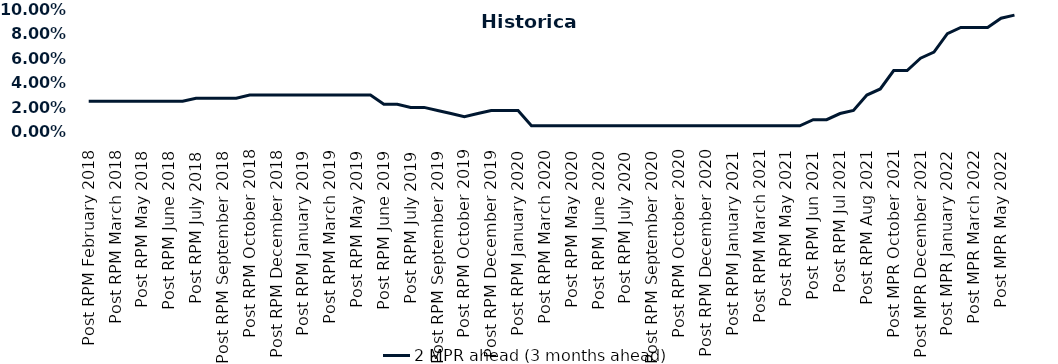
| Category | 2 MPR ahead (3 months ahead) |
|---|---|
| Post RPM February 2018 | 0.025 |
| Pre RPM March 2018 | 0.025 |
| Post RPM March 2018 | 0.025 |
| Pre RPM May 2018 | 0.025 |
| Post RPM May 2018 | 0.025 |
| Pre RPM June 2018 | 0.025 |
| Post RPM June 2018 | 0.025 |
| Pre RPM July 2018 | 0.025 |
| Post RPM July 2018 | 0.028 |
| Pre RPM September 2018 | 0.028 |
| Post RPM September 2018 | 0.028 |
| Pre RPM October 2018 | 0.028 |
| Post RPM October 2018 | 0.03 |
| Pre RPM December 2018 | 0.03 |
| Post RPM December 2018 | 0.03 |
| Pre RPM January 2019 | 0.03 |
| Post RPM January 2019 | 0.03 |
| Pre RPM March 2019 | 0.03 |
| Post RPM March 2019 | 0.03 |
| Pre RPM May 2019 | 0.03 |
| Post RPM May 2019 | 0.03 |
| Pre RPM June 2019 | 0.03 |
| Post RPM June 2019 | 0.022 |
| Pre RPM July 2019 | 0.022 |
| Post RPM July 2019 | 0.02 |
| Pre RPM September 2019 | 0.02 |
| Post RPM September 2019 | 0.018 |
| Pre RPM October 2019 | 0.015 |
| Post RPM October 2019 | 0.012 |
| Pre RPM December 2019 | 0.015 |
| Post RPM December 2019 | 0.018 |
| Pre RPM January 2020 | 0.018 |
| Post RPM January 2020 | 0.018 |
| Pre RPM March 2020 | 0.005 |
| Post RPM March 2020 | 0.005 |
| Pre RPM May 2020 | 0.005 |
| Post RPM May 2020 | 0.005 |
| Pre RPM June 2020 | 0.005 |
| Post RPM June 2020 | 0.005 |
| Pre RPM July 2020 | 0.005 |
| Post RPM July 2020 | 0.005 |
| Pre RPM September 2020 | 0.005 |
| Post RPM September 2020 | 0.005 |
| Pre RPM October 2020 | 0.005 |
| Post RPM October 2020 | 0.005 |
| Pre RPM December 2020 | 0.005 |
|  Post RPM December 2020 | 0.005 |
| Pre RPM January 2021 | 0.005 |
| Post RPM January 2021 | 0.005 |
|  Pre RPM March 2021 | 0.005 |
|  Post RPM March 2021 | 0.005 |
|  Pre RPM May 2021 | 0.005 |
|  Post RPM May 2021 | 0.005 |
|  Pre RPM Jun 2021 | 0.005 |
|   Post RPM Jun 2021 | 0.01 |
| Pre RPM Jul 2021 | 0.01 |
|  Post RPM Jul 2021 | 0.015 |
| Pre RPM Aug 2021 | 0.018 |
|  Post RPM Aug 2021 | 0.03 |
| Pre MPR October 2021 | 0.035 |
| Post MPR October 2021 | 0.05 |
| Pre MPR December 2021 | 0.05 |
| Post MPR December 2021 | 0.06 |
| Pre MPR January 2022 | 0.065 |
| Post MPR January 2022 | 0.08 |
| Pre MPR March 2022 | 0.085 |
| Post MPR March 2022 | 0.085 |
| Pre MPR May 2022 | 0.085 |
| Post MPR May 2022 | 0.092 |
| Pre MPR June 2022 | 0.095 |